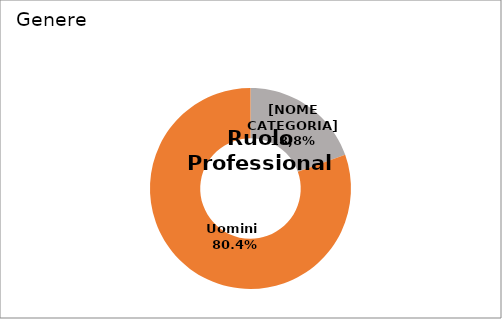
| Category | Series 0 |
|---|---|
| Donne  | 0.196 |
| Uomini  | 0.804 |